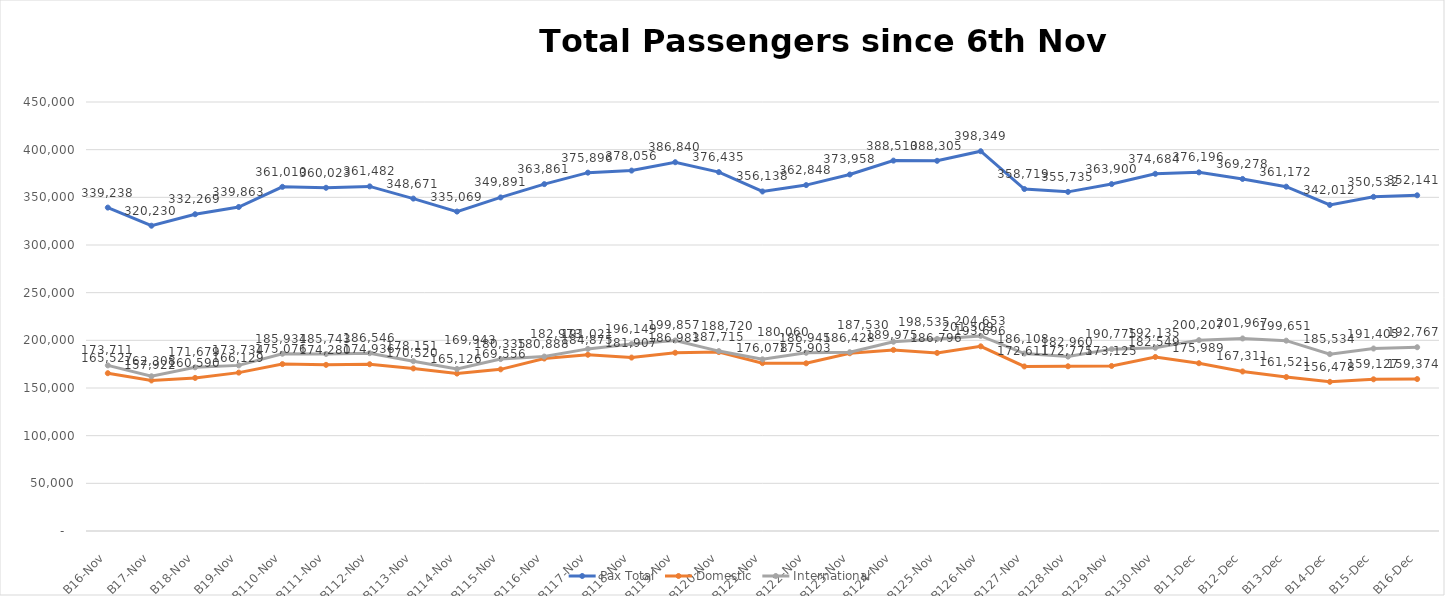
| Category | Pax Total | Domestic | International |
|---|---|---|---|
| 2023-11-06 | 339238 | 165527 | 173711 |
| 2023-11-07 | 320230 | 157922 | 162308 |
| 2023-11-08 | 332269 | 160590 | 171679 |
| 2023-11-09 | 339863 | 166129 | 173734 |
| 2023-11-10 | 361010 | 175076 | 185934 |
| 2023-11-11 | 360023 | 174280 | 185743 |
| 2023-11-12 | 361482 | 174936 | 186546 |
| 2023-11-13 | 348671 | 170520 | 178151 |
| 2023-11-14 | 335069 | 165126 | 169943 |
| 2023-11-15 | 349891 | 169556 | 180335 |
| 2023-11-16 | 363861 | 180888 | 182973 |
| 2023-11-17 | 375896 | 184875 | 191021 |
| 2023-11-18 | 378056 | 181907 | 196149 |
| 2023-11-19 | 386840 | 186983 | 199857 |
| 2023-11-20 | 376435 | 187715 | 188720 |
| 2023-11-21 | 356138 | 176078 | 180060 |
| 2023-11-22 | 362848 | 175903 | 186945 |
| 2023-11-23 | 373958 | 186428 | 187530 |
| 2023-11-24 | 388510 | 189975 | 198535 |
| 2023-11-25 | 388305 | 186796 | 201509 |
| 2023-11-26 | 398349 | 193696 | 204653 |
| 2023-11-27 | 358719 | 172611 | 186108 |
| 2023-11-28 | 355735 | 172775 | 182960 |
| 2023-11-29 | 363900 | 173125 | 190775 |
| 2023-11-30 | 374684 | 182549 | 192135 |
| 2023-12-01 | 376196 | 175989 | 200207 |
| 2023-12-02 | 369278 | 167311 | 201967 |
| 2023-12-03 | 361172 | 161521 | 199651 |
| 2023-12-04 | 342012 | 156478 | 185534 |
| 2023-12-05 | 350532 | 159127 | 191405 |
| 2023-12-06 | 352141 | 159374 | 192767 |